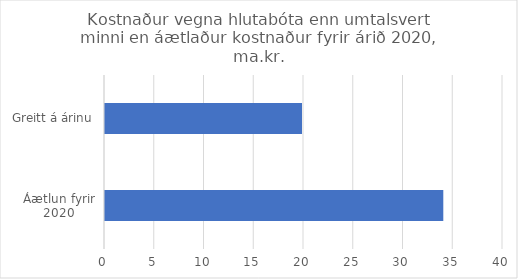
| Category | Series 0 |
|---|---|
| Áætlun fyrir 2020 | 34 |
| Greitt á árinu | 19.8 |